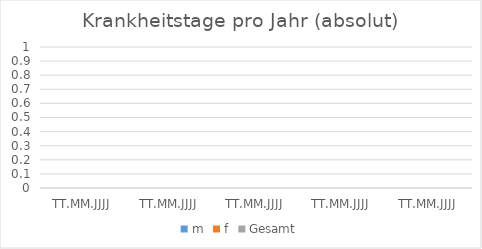
| Category | m | f | Gesamt |
|---|---|---|---|
| TT.MM.JJJJ | 0 | 0 | 0 |
| TT.MM.JJJJ | 0 | 0 | 0 |
| TT.MM.JJJJ | 0 | 0 | 0 |
| TT.MM.JJJJ | 0 | 0 | 0 |
| TT.MM.JJJJ | 0 | 0 | 0 |